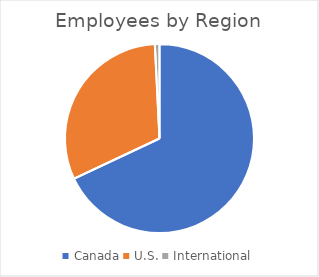
| Category | Series 0 |
|---|---|
| Canada | 62471 |
| U.S. | 28675 |
| International | 722 |